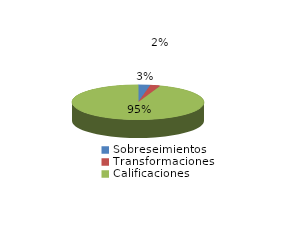
| Category | Series 0 |
|---|---|
| Sobreseimientos | 95 |
| Transformaciones | 80 |
| Calificaciones | 3051 |